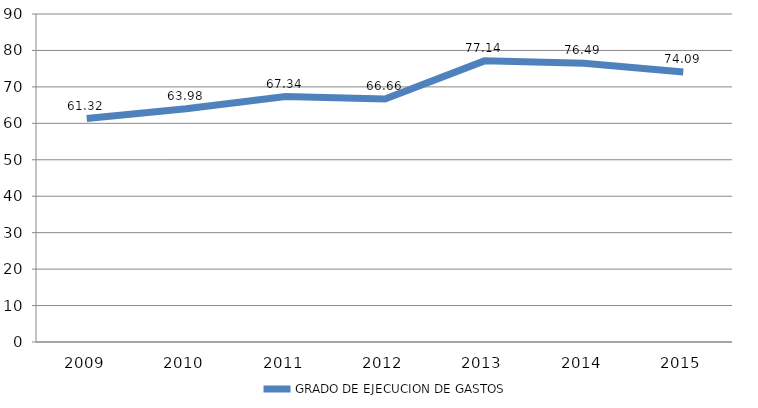
| Category | GRADO DE EJECUCION DE GASTOS |
|---|---|
| 2009.0 | 61.325 |
| 2010.0 | 63.985 |
| 2011.0 | 67.344 |
| 2012.0 | 66.661 |
| 2013.0 | 77.139 |
| 2014.0 | 76.485 |
| 2015.0 | 74.091 |